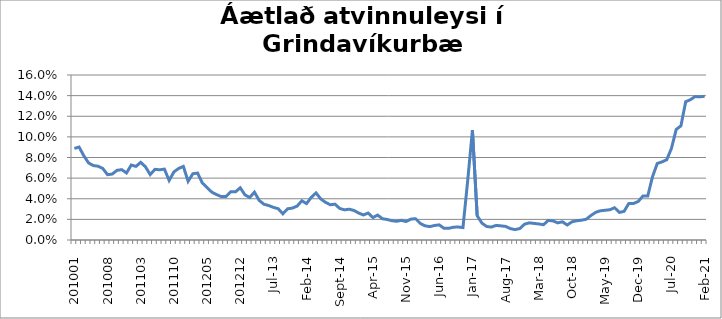
| Category | Series 0 |
|---|---|
| 201001 | 0.089 |
| 201002 | 0.09 |
| 201003 | 0.082 |
| 201004 | 0.075 |
| 201005 | 0.072 |
| 201006 | 0.072 |
| 201007 | 0.069 |
| 201008 | 0.063 |
| 201009 | 0.064 |
| 201010 | 0.068 |
| 201011 | 0.068 |
| 201012 | 0.065 |
| 201101 | 0.073 |
| 201102 | 0.071 |
| 201103 | 0.075 |
| 201104 | 0.071 |
| 201105 | 0.063 |
| 201106 | 0.069 |
| 201107 | 0.068 |
| 201108 | 0.069 |
| 201109 | 0.058 |
| 201110 | 0.066 |
| 201111 | 0.069 |
| 201112 | 0.071 |
| 201201 | 0.057 |
| 201202 | 0.064 |
| 201203 | 0.065 |
| 201204 | 0.055 |
| 201205 | 0.051 |
| 201206 | 0.046 |
| 201207 | 0.044 |
| 201208 | 0.042 |
| 201209 | 0.042 |
| 201210 | 0.047 |
| 201211 | 0.047 |
| 201212 | 0.051 |
| jan.13 | 0.044 |
| feb.13 | 0.041 |
| mar.13 | 0.046 |
| apr.13 | 0.038 |
| maí.13 | 0.035 |
| jún.13 | 0.033 |
| júl.13 | 0.032 |
| ágú.13 | 0.03 |
| sep.13 | 0.025 |
| okt.13 | 0.03 |
| nóv.13 | 0.031 |
| des.13 | 0.033 |
| jan.14 | 0.038 |
| feb.14 | 0.035 |
| mar.14 | 0.041 |
| apr.14 | 0.046 |
| maí.14 | 0.04 |
| jún.14 | 0.037 |
| júl.14 | 0.034 |
| ágú.14 | 0.035 |
| sep.14 | 0.031 |
| okt.14 | 0.029 |
| nóv.14 | 0.03 |
| des.14 | 0.029 |
| jan.15 | 0.026 |
| feb.15 | 0.024 |
| mar.15 | 0.026 |
| apr.15 | 0.022 |
| maí.15 | 0.024 |
| jún.15 | 0.021 |
| júl.15 | 0.02 |
| ágú.15 | 0.019 |
| sep.15 | 0.018 |
| okt.15 | 0.019 |
| nóv.15 | 0.018 |
| des.15 | 0.02 |
| jan.16 | 0.021 |
| feb.16 | 0.016 |
| mar.16 | 0.014 |
| apr.16 | 0.013 |
| maí.16 | 0.014 |
| jún.16 | 0.015 |
| júl.16 | 0.011 |
| ágú.16 | 0.011 |
| sep.16 | 0.012 |
| okt.16 | 0.013 |
| nóv.16 | 0.012 |
| des.16 | 0.058 |
| jan.17 | 0.106 |
| feb.17 | 0.023 |
| mar.17 | 0.016 |
| apr.17 | 0.013 |
| maí.17 | 0.013 |
| jún.17 | 0.014 |
| júl.17 | 0.014 |
| ágú.17 | 0.013 |
| sep.17 | 0.011 |
| okt.17 | 0.01 |
| nóv.17 | 0.011 |
| des.17 | 0.015 |
| jan.18 | 0.017 |
| feb.18 | 0.016 |
| mar.18 | 0.016 |
| apr.18 | 0.015 |
| maí.18 | 0.019 |
| jún.18 | 0.018 |
| júl.18 | 0.017 |
| ágú.18 | 0.018 |
| sep.18 | 0.015 |
| okt.18 | 0.018 |
| nóv.18 | 0.019 |
| des.18 | 0.019 |
| jan.19 | 0.02 |
| feb.19 | 0.024 |
| mar.19 | 0.027 |
| apr.19 | 0.028 |
| maí.19 | 0.029 |
| jún.19 | 0.029 |
| júl.19 | 0.031 |
| ágú.19 | 0.027 |
| sep.19 | 0.028 |
| okt.19 | 0.035 |
| nóv.19 | 0.035 |
| des.19 | 0.037 |
| jan.20 | 0.043 |
| feb.20 | 0.043 |
| mars 2020 *** | 0.061 |
| apr.20 | 0.074 |
| maí.20 | 0.076 |
| jún.20 | 0.078 |
| júl.20 | 0.089 |
| ágú.20 | 0.107 |
| sep.20 | 0.111 |
| okt.20 | 0.134 |
| nóv.20 | 0.136 |
| des.20 | 0.139 |
| jan.21 | 0.139 |
| feb.21 | 0.139 |